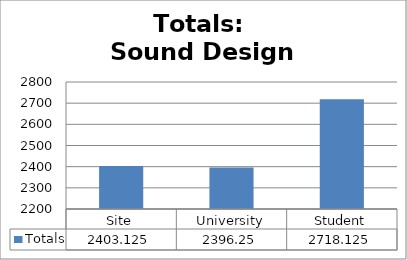
| Category | Totals |
|---|---|
| Site | 2403.125 |
| University | 2396.25 |
| Student | 2718.125 |